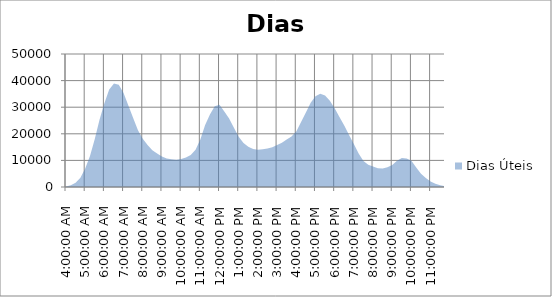
| Category | Dias Úteis |
|---|---|
| 0.16666666666666663 | 209.4 |
| 0.1770833333333333 | 683.4 |
| 0.18749999999999994 | 1642.4 |
| 0.1979166666666666 | 3453.6 |
| 0.20833333333333326 | 6952.6 |
| 0.21874999999999992 | 11670 |
| 0.22916666666666657 | 18073.4 |
| 0.23958333333333323 | 25400.8 |
| 0.2499999999999999 | 31501.4 |
| 0.2604166666666666 | 36690.2 |
| 0.27083333333333326 | 38952.8 |
| 0.28124999999999994 | 38430.6 |
| 0.29166666666666663 | 35334.4 |
| 0.3020833333333333 | 30659.6 |
| 0.3125 | 25903 |
| 0.3229166666666667 | 21328.4 |
| 0.33333333333333337 | 18184.6 |
| 0.34375000000000006 | 15804.8 |
| 0.35416666666666674 | 13809.8 |
| 0.3645833333333334 | 12576.6 |
| 0.3750000000000001 | 11475.4 |
| 0.3854166666666668 | 10731 |
| 0.3958333333333335 | 10473.6 |
| 0.40625000000000017 | 10284.2 |
| 0.41666666666666685 | 10510.4 |
| 0.42708333333333354 | 11051.6 |
| 0.4375000000000002 | 12064 |
| 0.4479166666666669 | 14024.6 |
| 0.4583333333333336 | 17886.2 |
| 0.4687500000000003 | 23288 |
| 0.47916666666666696 | 27248.4 |
| 0.48958333333333365 | 30350.6 |
| 0.5000000000000003 | 30941.6 |
| 0.510416666666667 | 28407.2 |
| 0.5208333333333336 | 25797.6 |
| 0.5312500000000002 | 22321 |
| 0.5416666666666669 | 18920.2 |
| 0.5520833333333335 | 16499 |
| 0.5625000000000001 | 15115.2 |
| 0.5729166666666667 | 14321.4 |
| 0.5833333333333334 | 14005.4 |
| 0.59375 | 14209.4 |
| 0.6041666666666666 | 14432.6 |
| 0.6145833333333333 | 14989.6 |
| 0.6249999999999999 | 15776.8 |
| 0.6354166666666665 | 16656.6 |
| 0.6458333333333331 | 17871.4 |
| 0.6562499999999998 | 18952 |
| 0.6666666666666664 | 20824.6 |
| 0.677083333333333 | 24449.6 |
| 0.6874999999999997 | 27963.4 |
| 0.6979166666666663 | 31700.6 |
| 0.7083333333333329 | 34088.8 |
| 0.7187499999999996 | 35010.2 |
| 0.7291666666666662 | 34391.8 |
| 0.7395833333333328 | 32386.6 |
| 0.7499999999999994 | 29626 |
| 0.7604166666666661 | 26338.8 |
| 0.7708333333333327 | 23150.6 |
| 0.7812499999999993 | 19537.6 |
| 0.791666666666666 | 16140 |
| 0.8020833333333326 | 12611.2 |
| 0.8124999999999992 | 9773 |
| 0.8229166666666659 | 8339.2 |
| 0.8333333333333325 | 7677 |
| 0.8437499999999991 | 7062.2 |
| 0.8541666666666657 | 6961.6 |
| 0.8645833333333324 | 7437.8 |
| 0.874999999999999 | 8235.2 |
| 0.8854166666666656 | 9840 |
| 0.8958333333333323 | 10927.2 |
| 0.9062499999999989 | 10733.8 |
| 0.9166666666666655 | 9877.8 |
| 0.9270833333333321 | 7369.6 |
| 0.9374999999999988 | 5014.2 |
| 0.9479166666666654 | 3392.2 |
| 0.958333333333332 | 2080.8 |
| 0.9687499999999987 | 1212.2 |
| 0.9791666666666653 | 675.6 |
| 0.9895833333333319 | 268.2 |